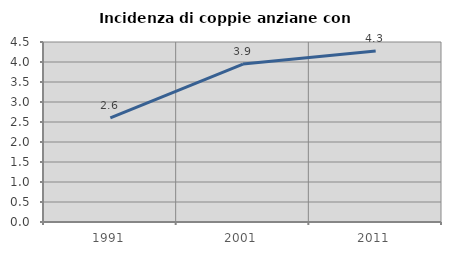
| Category | Incidenza di coppie anziane con figli |
|---|---|
| 1991.0 | 2.603 |
| 2001.0 | 3.947 |
| 2011.0 | 4.277 |